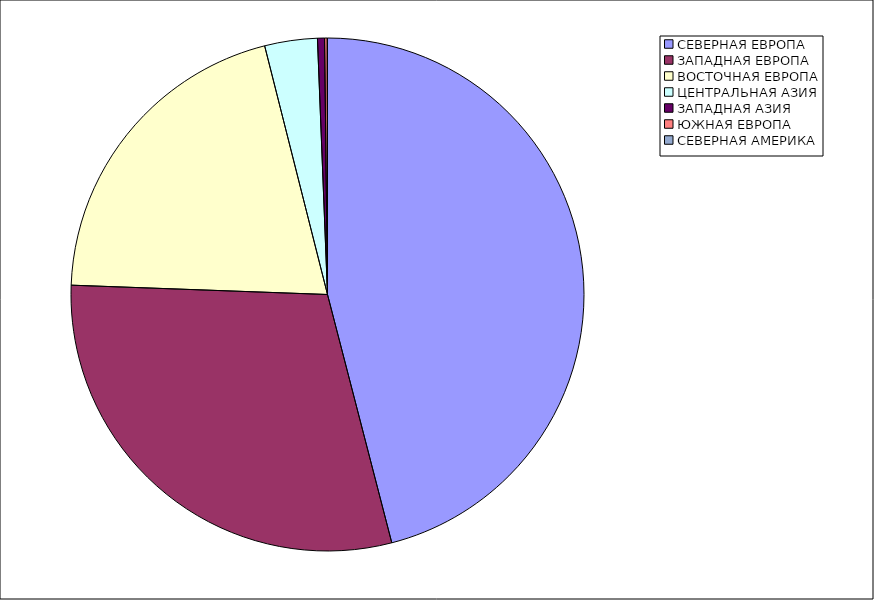
| Category | Оборот |
|---|---|
| СЕВЕРНАЯ ЕВРОПА | 45.966 |
| ЗАПАДНАЯ ЕВРОПА | 29.613 |
| ВОСТОЧНАЯ ЕВРОПА | 20.479 |
| ЦЕНТРАЛЬНАЯ АЗИЯ | 3.316 |
| ЗАПАДНАЯ АЗИЯ | 0.444 |
| ЮЖНАЯ ЕВРОПА | 0.166 |
| СЕВЕРНАЯ АМЕРИКА | 0.015 |